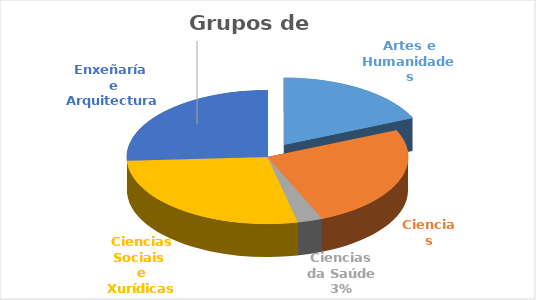
| Category | nº de grupos de investigación |
|---|---|
| Artes e Humanidades | 32 |
| Ciencias | 44 |
| Ciencias da Saúde | 5 |
| Ciencias Sociais 
e Xurídicas | 48 |
| Enxeñaría 
e Arquitectura | 45 |